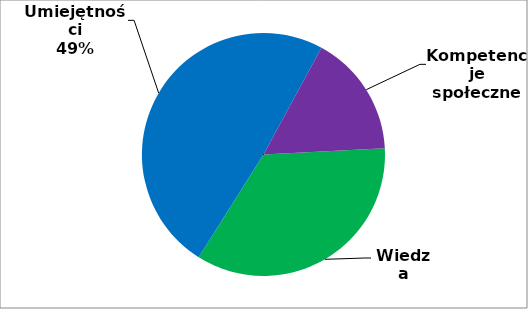
| Category | Series 0 |
|---|---|
| 0 | 167 |
| 1 | 235 |
| 2 | 78 |